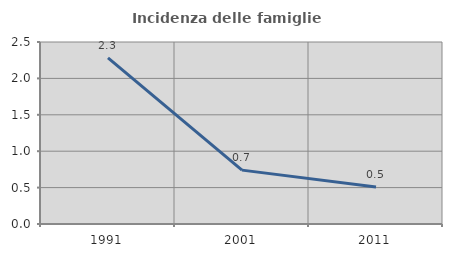
| Category | Incidenza delle famiglie numerose |
|---|---|
| 1991.0 | 2.281 |
| 2001.0 | 0.74 |
| 2011.0 | 0.509 |